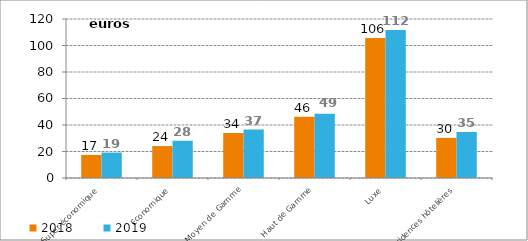
| Category | 2018 | 2019 |
|---|---|---|
| Super-économique | 17.399 | 19.177 |
| Economique | 24.104 | 28.097 |
| Moyen de Gamme | 34.02 | 36.594 |
| Haut de Gamme | 46.133 | 48.536 |
| Luxe | 105.732 | 111.666 |
| Résidences hôtelières | 30.262 | 34.687 |